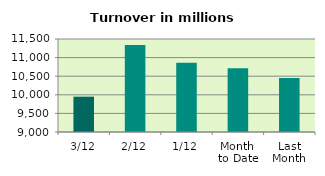
| Category | Series 0 |
|---|---|
| 3/12 | 9949.961 |
| 2/12 | 11336.082 |
| 1/12 | 10860.98 |
| Month 
to Date | 10715.674 |
| Last
Month | 10449.431 |